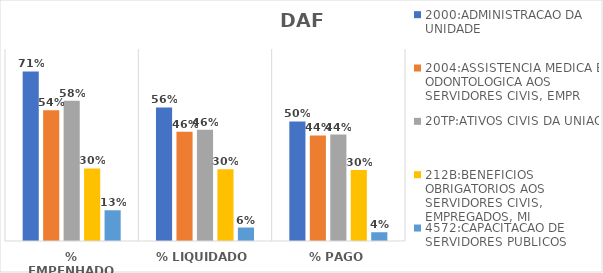
| Category | 2000:ADMINISTRACAO DA UNIDADE | 2004:ASSISTENCIA MEDICA E ODONTOLOGICA AOS SERVIDORES CIVIS, EMPR | 20TP:ATIVOS CIVIS DA UNIAO | 212B:BENEFICIOS OBRIGATORIOS AOS SERVIDORES CIVIS, EMPREGADOS, MI | 4572:CAPACITACAO DE SERVIDORES PUBLICOS FEDERAIS EM PROCESSO DE Q |
|---|---|---|---|---|---|
| % EMPENHADO | 0.706 | 0.544 | 0.584 | 0.303 | 0.128 |
| % LIQUIDADO | 0.556 | 0.456 | 0.463 | 0.299 | 0.056 |
| % PAGO | 0.498 | 0.44 | 0.444 | 0.295 | 0.037 |